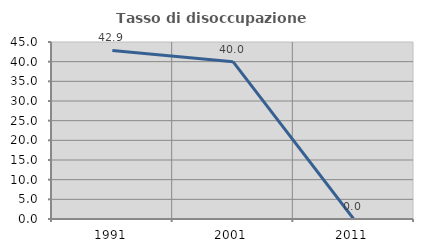
| Category | Tasso di disoccupazione giovanile  |
|---|---|
| 1991.0 | 42.857 |
| 2001.0 | 40 |
| 2011.0 | 0 |